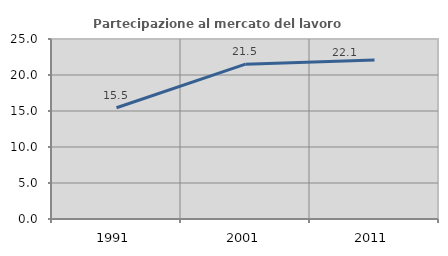
| Category | Partecipazione al mercato del lavoro  femminile |
|---|---|
| 1991.0 | 15.455 |
| 2001.0 | 21.505 |
| 2011.0 | 22.093 |